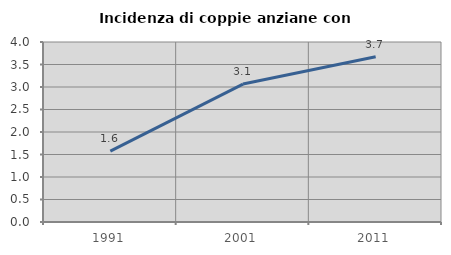
| Category | Incidenza di coppie anziane con figli |
|---|---|
| 1991.0 | 1.574 |
| 2001.0 | 3.065 |
| 2011.0 | 3.673 |